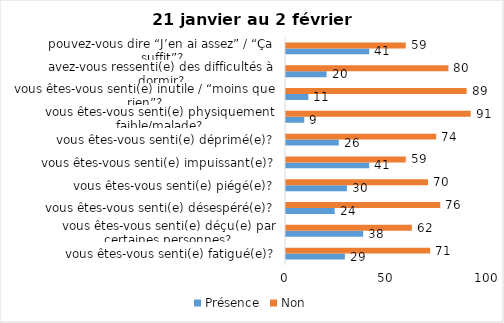
| Category | Présence | Non |
|---|---|---|
| vous êtes-vous senti(e) fatigué(e)? | 29 | 71 |
| vous êtes-vous senti(e) déçu(e) par certaines personnes? | 38 | 62 |
| vous êtes-vous senti(e) désespéré(e)? | 24 | 76 |
| vous êtes-vous senti(e) piégé(e)? | 30 | 70 |
| vous êtes-vous senti(e) impuissant(e)? | 41 | 59 |
| vous êtes-vous senti(e) déprimé(e)? | 26 | 74 |
| vous êtes-vous senti(e) physiquement faible/malade? | 9 | 91 |
| vous êtes-vous senti(e) inutile / “moins que rien”? | 11 | 89 |
| avez-vous ressenti(e) des difficultés à dormir? | 20 | 80 |
| pouvez-vous dire “J’en ai assez” / “Ça suffit”? | 41 | 59 |